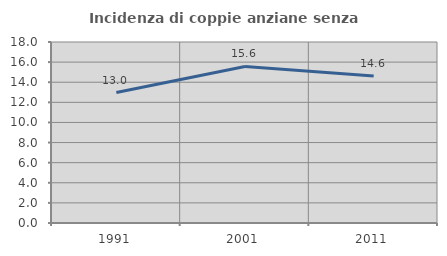
| Category | Incidenza di coppie anziane senza figli  |
|---|---|
| 1991.0 | 12.97 |
| 2001.0 | 15.569 |
| 2011.0 | 14.612 |